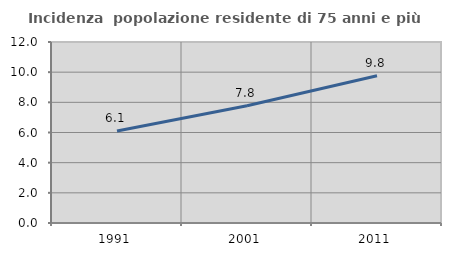
| Category | Incidenza  popolazione residente di 75 anni e più |
|---|---|
| 1991.0 | 6.102 |
| 2001.0 | 7.774 |
| 2011.0 | 9.762 |